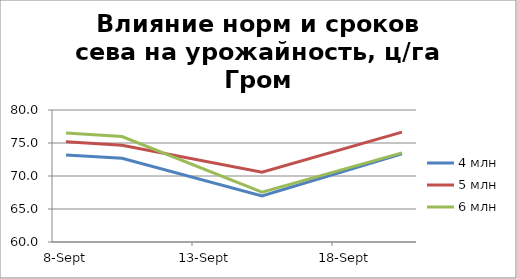
| Category | 4 млн | 5 млн | 6 млн |
|---|---|---|---|
| 2016-09-08 | 73.172 | 75.191 | 76.502 |
| 2016-09-10 | 72.69 | 74.647 | 75.969 |
| 2016-09-15 | 66.973 | 70.568 | 67.558 |
| 2016-09-20 | 73.371 | 76.647 | 73.512 |